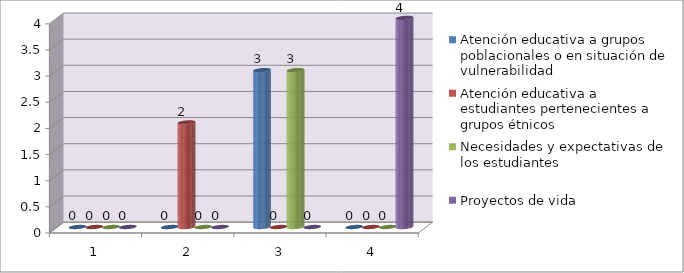
| Category | Atención educativa a grupos poblacionales o en situación de vulnerabilidad | Atención educativa a
estudiantes pertenecientes a grupos étnicos | Necesidades y expectativas de los estudiantes | Proyectos de vida |
|---|---|---|---|---|
| 0 | 0 | 0 | 0 | 0 |
| 1 | 0 | 2 | 0 | 0 |
| 2 | 3 | 0 | 3 | 0 |
| 3 | 0 | 0 | 0 | 4 |